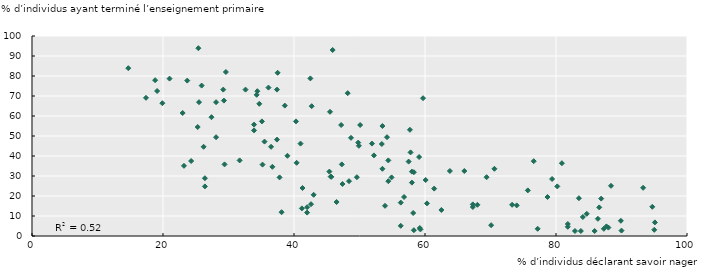
| Category | Series 0 |
|---|---|
| 23.700000762939453 | 77.7 |
| 50.099998474121094 | 55.5 |
| 53.400001525878906 | 46 |
| 53.5 | 33.6 |
| 38.099998474121094 | 11.9 |
| 88.0 | 4.2 |
| 87.69999694824219 | 4.8 |
| 42.599998474121094 | 15.9 |
| 59.20000076293945 | 4 |
| 80.9000015258789 | 36.4 |
| 81.80000305175781 | 4.6 |
| 19.899999618530273 | 66.4 |
| 49.599998474121094 | 29.4 |
| 70.5999984741211 | 33.6 |
| 24.299999237060547 | 37.5 |
| 52.20000076293945 | 40.3 |
| 45.599998474121094 | 29.7 |
| 29.600000381469727 | 82 |
| 45.900001525878906 | 93 |
| 28.100000381469727 | 49.4 |
| 82.9000015258789 | 2.5 |
| 37.5 | 81.6 |
| 61.400001525878906 | 23.7 |
| 25.5 | 66.9 |
| 43.0 | 20.6 |
| 58.29999923706055 | 31.9 |
| 35.20000076293945 | 35.7 |
| 57.79999923706055 | 41.8 |
| 23.0 | 61.5 |
| 88.4000015258789 | 25.1 |
| 87.30000305175781 | 3.6 |
| 51.900001525878906 | 46.2 |
| 56.79999923706055 | 19.5 |
| 23.200000762939453 | 35.1 |
| 48.20000076293945 | 71.4 |
| 78.69999694824219 | 19.5 |
| 37.400001525878906 | 48.2 |
| 18.799999237060547 | 77.9 |
| 93.30000305175781 | 24.1 |
| 84.0999984741211 | 9.5 |
| 48.70000076293945 | 49.1 |
| 28.100000381469727 | 66.9 |
| 42.0 | 11.7 |
| 90.0 | 2.7 |
| 29.399999618530273 | 35.8 |
| 80.19999694824219 | 24.8 |
| 40.29999923706055 | 57.3 |
| 37.400001525878906 | 73.2 |
| 45.5 | 62.1 |
| 56.29999923706055 | 16.7 |
| 60.099998474121094 | 28 |
| 33.900001525878906 | 52.8 |
| 41.0 | 46.2 |
| 37.79999923706055 | 29.3 |
| 35.099998474121094 | 57.3 |
| 77.19999694824219 | 3.6 |
| 70.0999984741211 | 5.4 |
| 76.5999984741211 | 37.4 |
| 36.70000076293945 | 34.6 |
| 62.5 | 13 |
| 26.399999618530273 | 24.8 |
| 67.30000305175781 | 15.8 |
| 36.5 | 44.6 |
| 53.900001525878906 | 15.1 |
| 53.5 | 55 |
| 56.29999923706055 | 5.1 |
| 46.5 | 17 |
| 57.70000076293945 | 53.1 |
| 75.69999694824219 | 22.8 |
| 58.0 | 32.2 |
| 42.70000076293945 | 64.9 |
| 29.299999237060547 | 67.7 |
| 41.20000076293945 | 13.8 |
| 81.80000305175781 | 6 |
| 85.9000015258789 | 2.5 |
| 42.5 | 78.8 |
| 34.400001525878906 | 72.4 |
| 42.0 | 14.4 |
| 34.29999923706055 | 70.6 |
| 86.5999984741211 | 14.3 |
| 32.599998474121094 | 73.2 |
| 57.5 | 37.2 |
| 45.400001525878906 | 32.2 |
| 58.20000076293945 | 11.5 |
| 26.399999618530273 | 28.9 |
| 79.4000015258789 | 28.5 |
| 38.599998474121094 | 65.2 |
| 36.099998474121094 | 74.2 |
| 34.70000076293945 | 66.1 |
| 39.0 | 40.1 |
| 25.899999618530273 | 75.2 |
| 95.0 | 3.1 |
| 84.69999694824219 | 11.1 |
| 47.20000076293945 | 55.5 |
| 25.399999618530273 | 93.9 |
| 31.700000762939453 | 37.8 |
| 59.099998474121094 | 39.5 |
| 94.69999694824219 | 14.6 |
| 17.399999618530273 | 69.1 |
| 66.0 | 32.5 |
| 40.400001525878906 | 36.6 |
| 48.400001525878906 | 27.4 |
| 47.400001525878906 | 26 |
| 67.30000305175781 | 14.5 |
| 63.79999923706055 | 32.5 |
| 45.70000076293945 | 29.6 |
| 14.699999809265137 | 83.9 |
| 59.29999923706055 | 3.3 |
| 19.100000381469727 | 72.5 |
| 69.4000015258789 | 29.4 |
| 29.200000762939453 | 73.2 |
| 68.0 | 15.6 |
| 74.0 | 15.3 |
| 89.9000015258789 | 7.6 |
| 41.29999923706055 | 24 |
| 83.5 | 18.9 |
| 33.900001525878906 | 55.7 |
| 95.0999984741211 | 6.8 |
| 86.9000015258789 | 18.7 |
| 58.0 | 26.7 |
| 21.0 | 78.7 |
| 59.70000076293945 | 68.9 |
| 25.299999237060547 | 54.5 |
| 49.79999923706055 | 46.7 |
| 54.400001525878906 | 37.8 |
| 60.29999923706055 | 16.3 |
| 58.29999923706055 | 2.9 |
| 26.200000762939453 | 44.6 |
| 73.30000305175781 | 15.6 |
| 86.4000015258789 | 8.6 |
| 83.80000305175781 | 2.5 |
| 54.20000076293945 | 49.4 |
| 54.400001525878906 | 27.4 |
| 54.900001525878906 | 29.3 |
| 49.900001525878906 | 45.1 |
| 27.399999618530273 | 59.4 |
| 35.5 | 47.2 |
| 47.29999923706055 | 35.8 |